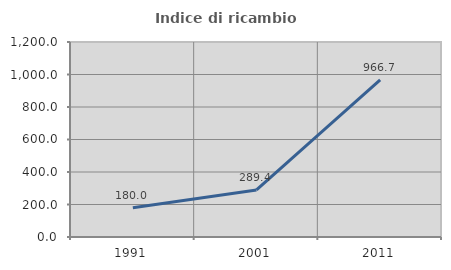
| Category | Indice di ricambio occupazionale  |
|---|---|
| 1991.0 | 180 |
| 2001.0 | 289.362 |
| 2011.0 | 966.667 |